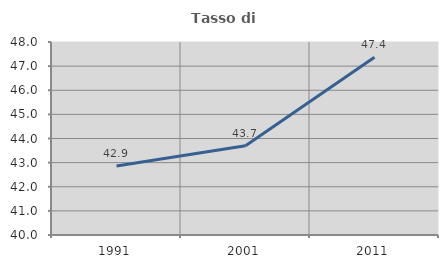
| Category | Tasso di occupazione   |
|---|---|
| 1991.0 | 42.857 |
| 2001.0 | 43.704 |
| 2011.0 | 47.368 |